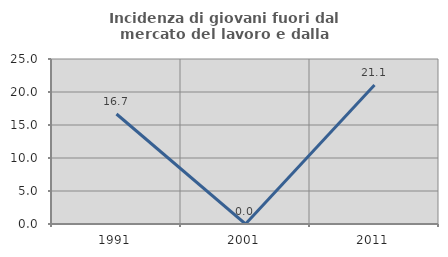
| Category | Incidenza di giovani fuori dal mercato del lavoro e dalla formazione  |
|---|---|
| 1991.0 | 16.667 |
| 2001.0 | 0 |
| 2011.0 | 21.053 |